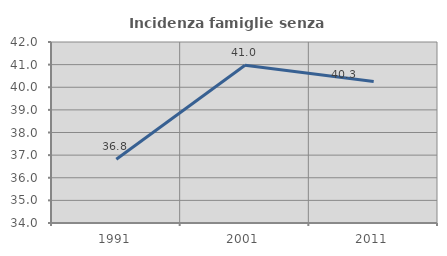
| Category | Incidenza famiglie senza nuclei |
|---|---|
| 1991.0 | 36.816 |
| 2001.0 | 40.969 |
| 2011.0 | 40.254 |